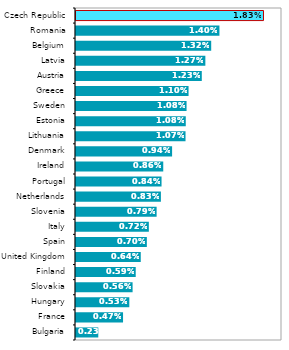
| Category | podíl na HDP |
|---|---|
| Bulgaria | 0.002 |
| France | 0.005 |
| Hungary | 0.005 |
| Slovakia | 0.006 |
| Finland | 0.006 |
| United Kingdom | 0.006 |
| Spain | 0.007 |
| Italy | 0.007 |
| Slovenia | 0.008 |
| Netherlands | 0.008 |
| Portugal | 0.008 |
| Ireland | 0.009 |
| Denmark | 0.009 |
| Lithuania | 0.011 |
| Estonia | 0.011 |
| Sweden | 0.011 |
| Greece | 0.011 |
| Austria | 0.012 |
| Latvia | 0.013 |
| Belgium | 0.013 |
| Romania | 0.014 |
| Czech Republic | 0.018 |